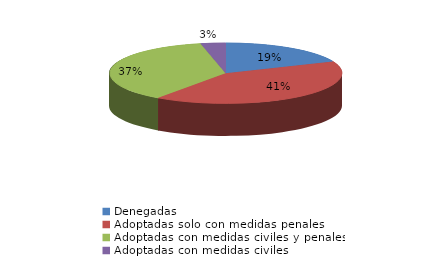
| Category | Series 0 |
|---|---|
| Denegadas | 38 |
| Adoptadas solo con medidas penales | 84 |
| Adoptadas con medidas civiles y penales | 75 |
| Adoptadas con medidas civiles | 7 |